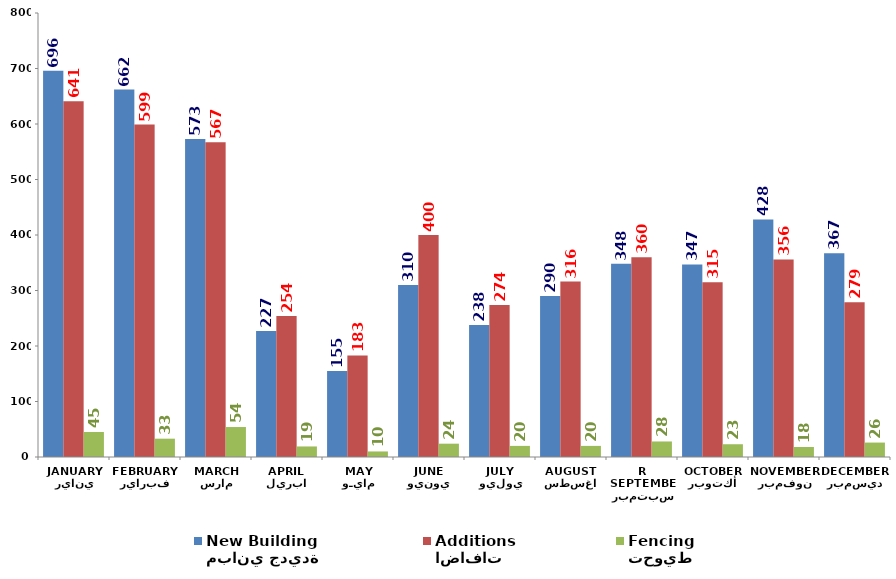
| Category | مباني جديدة
New Building | اضافات
Additions | تحويط
Fencing |
|---|---|---|---|
| يناير
JANUARY | 696 | 641 | 45 |
| فبراير
FEBRUARY | 662 | 599 | 33 |
| مارس
MARCH | 573 | 567 | 54 |
| ابريل
APRIL | 227 | 254 | 19 |
| مايـو
MAY
 | 155 | 183 | 10 |
| يونيو
JUNE | 310 | 400 | 24 |
| يوليو
JULY | 238 | 274 | 20 |
| اغسطس
AUGUST | 290 | 316 | 20 |
| سبتمبر
SEPTEMBER | 348 | 360 | 28 |
| أكتوبر
OCTOBER | 347 | 315 | 23 |
| نوفمبر
NOVEMBER | 428 | 356 | 18 |
| ديسمبر
DECEMBER | 367 | 279 | 26 |